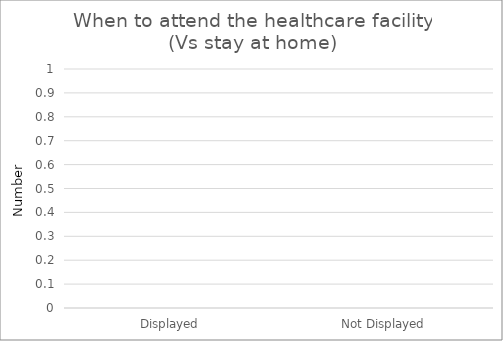
| Category | When to attend the healthcare facility (Vs stay at home) |
|---|---|
| Displayed | 0 |
| Not Displayed | 0 |